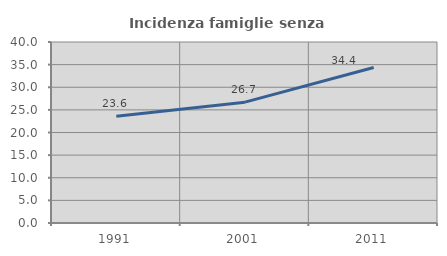
| Category | Incidenza famiglie senza nuclei |
|---|---|
| 1991.0 | 23.601 |
| 2001.0 | 26.703 |
| 2011.0 | 34.371 |